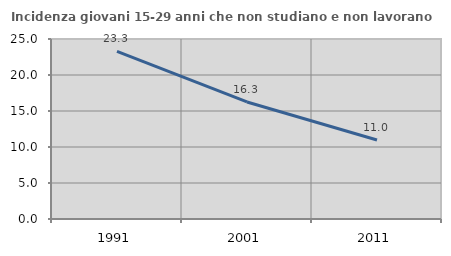
| Category | Incidenza giovani 15-29 anni che non studiano e non lavorano  |
|---|---|
| 1991.0 | 23.284 |
| 2001.0 | 16.254 |
| 2011.0 | 10.976 |